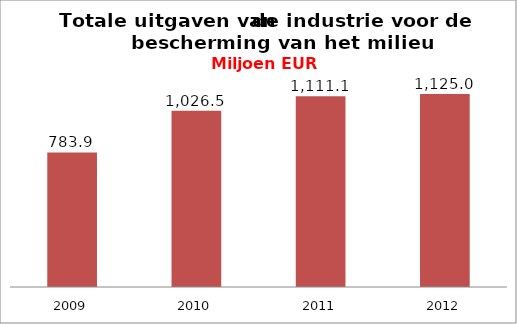
| Category | Totale uitgaven (5) = (3) + (4) |
|---|---|
| 2009.0 | 783.9 |
| 2010.0 | 1026.5 |
| 2011.0 | 1111.1 |
| 2012.0 | 1125 |